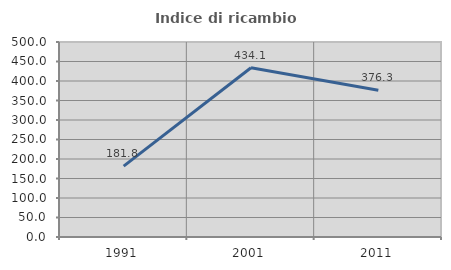
| Category | Indice di ricambio occupazionale  |
|---|---|
| 1991.0 | 181.818 |
| 2001.0 | 434.091 |
| 2011.0 | 376.271 |